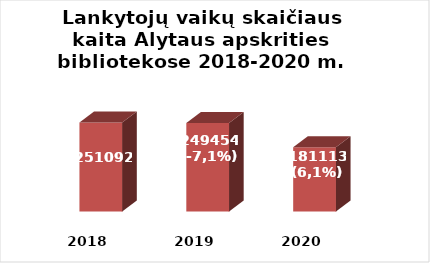
| Category | Series 0 |
|---|---|
| 2018.0 | 251092 |
| 2019.0 | 249454 |
| 2020.0 | 181113 |